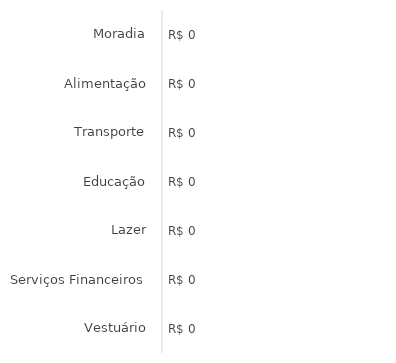
| Category | Series 0 |
|---|---|
| Moradia | 0 |
| Alimentação | 0 |
| Transporte | 0 |
| Educação | 0 |
| Lazer | 0 |
| Serviços Financeiros | 0 |
| Vestuário | 0 |